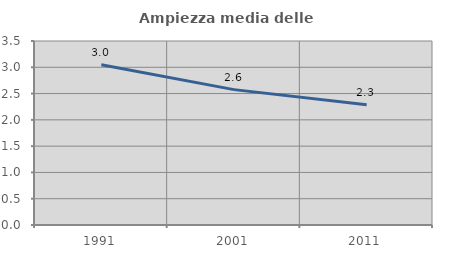
| Category | Ampiezza media delle famiglie |
|---|---|
| 1991.0 | 3.047 |
| 2001.0 | 2.575 |
| 2011.0 | 2.287 |